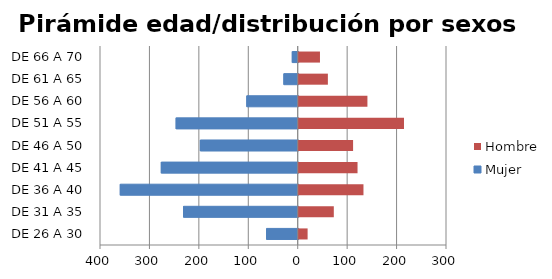
| Category | Mujer | Hombre |
|---|---|---|
| DE 26 A 30 | -64 | 18 |
| DE 31 A 35 | -232 | 71 |
| DE 36 A 40 | -360 | 131 |
| DE 41 A 45 | -277 | 119 |
| DE 46 A 50 | -198 | 110 |
| DE 51 A 55 | -247 | 213 |
| DE 56 A 60 | -104 | 139 |
| DE 61 A 65 | -29 | 59 |
| DE 66 A 70 | -12 | 43 |